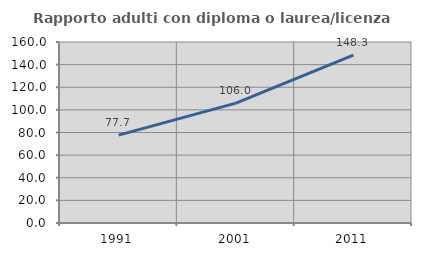
| Category | Rapporto adulti con diploma o laurea/licenza media  |
|---|---|
| 1991.0 | 77.702 |
| 2001.0 | 106.006 |
| 2011.0 | 148.323 |